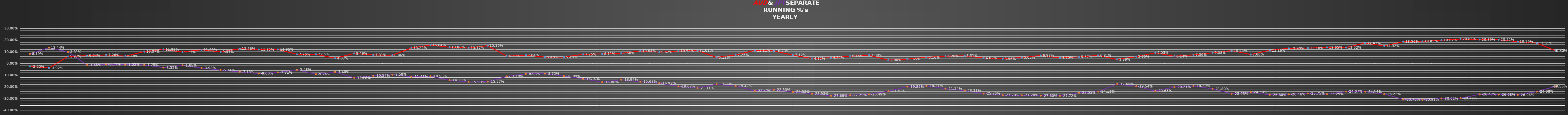
| Category | Series 0 | Series 1 |
|---|---|---|
| 0 | -0.026 | 0.082 |
| 1 | -0.039 | 0.134 |
| 2 | 0.06 | 0.038 |
| 3 | 0.066 | -0.015 |
| 4 | 0.073 | -0.008 |
| 5 | 0.062 | -0.01 |
| 6 | 0.101 | -0.012 |
| 7 | 0.119 | -0.036 |
| 8 | 0.098 | -0.016 |
| 9 | 0.116 | -0.04 |
| 10 | 0.099 | -0.057 |
| 11 | 0.126 | -0.072 |
| 12 | 0.118 | -0.086 |
| 13 | 0.12 | -0.077 |
| 14 | 0.078 | -0.055 |
| 15 | 0.078 | -0.092 |
| 16 | 0.044 | -0.074 |
| 17 | 0.085 | -0.123 |
| 18 | 0.073 | -0.105 |
| 19 | 0.07 | -0.096 |
| 20 | 0.132 | -0.114 |
| 21 | 0.156 | -0.11 |
| 22 | 0.139 | -0.143 |
| 23 | 0.132 | -0.159 |
| 24 | 0.152 | -0.156 |
| 25 | 0.062 | -0.111 |
| 26 | 0.07 | -0.089 |
| 27 | 0.054 | -0.088 |
| 28 | 0.054 | -0.109 |
| 29 | 0.078 | -0.131 |
| 30 | 0.081 | -0.161 |
| 31 | 0.086 | -0.139 |
| 32 | 0.106 | -0.156 |
| 33 | 0.096 | -0.169 |
| 34 | 0.106 | -0.197 |
| 35 | 0.11 | -0.211 |
| 36 | 0.051 | -0.178 |
| 37 | 0.072 | -0.195 |
| 38 | 0.111 | -0.235 |
| 39 | 0.107 | -0.225 |
| 40 | 0.071 | -0.243 |
| 41 | 0.041 | -0.259 |
| 42 | 0.048 | -0.277 |
| 43 | 0.062 | -0.272 |
| 44 | 0.07 | -0.265 |
| 45 | 0.028 | -0.238 |
| 46 | 0.036 | -0.198 |
| 47 | 0.052 | -0.192 |
| 48 | 0.062 | -0.215 |
| 49 | 0.065 | -0.232 |
| 50 | 0.046 | -0.258 |
| 51 | 0.04 | -0.272 |
| 52 | 0.05 | -0.273 |
| 53 | 0.068 | -0.276 |
| 54 | 0.047 | -0.277 |
| 55 | 0.056 | -0.25 |
| 56 | 0.068 | -0.241 |
| 57 | 0.034 | -0.176 |
| 58 | 0.058 | -0.195 |
| 59 | 0.09 | -0.236 |
| 60 | 0.061 | -0.202 |
| 61 | 0.074 | -0.193 |
| 62 | 0.091 | -0.218 |
| 63 | 0.11 | -0.26 |
| 64 | 0.076 | -0.245 |
| 65 | 0.112 | -0.268 |
| 66 | 0.129 | -0.265 |
| 67 | 0.131 | -0.258 |
| 68 | 0.136 | -0.263 |
| 69 | 0.135 | -0.241 |
| 70 | 0.174 | -0.241 |
| 71 | 0.149 | -0.262 |
| 72 | 0.186 | -0.308 |
| 73 | 0.188 | -0.309 |
| 74 | 0.198 | -0.3 |
| 75 | 0.209 | -0.298 |
| 76 | 0.204 | -0.265 |
| 77 | 0.202 | -0.267 |
| 78 | 0.186 | -0.269 |
| 79 | 0.173 | -0.241 |
| 80 | 0.108 | -0.196 |